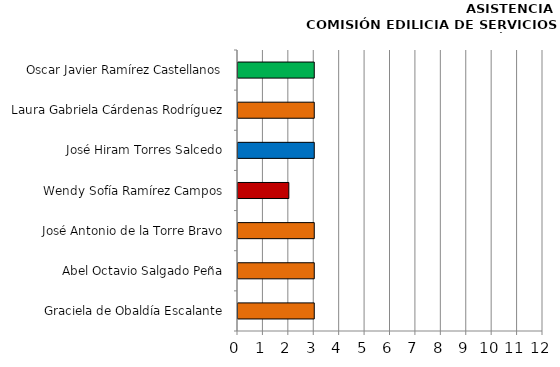
| Category | Series 0 |
|---|---|
| Graciela de Obaldía Escalante | 3 |
| Abel Octavio Salgado Peña | 3 |
| José Antonio de la Torre Bravo | 3 |
| Wendy Sofía Ramírez Campos | 2 |
| José Hiram Torres Salcedo | 3 |
| Laura Gabriela Cárdenas Rodríguez | 3 |
| Oscar Javier Ramírez Castellanos | 3 |